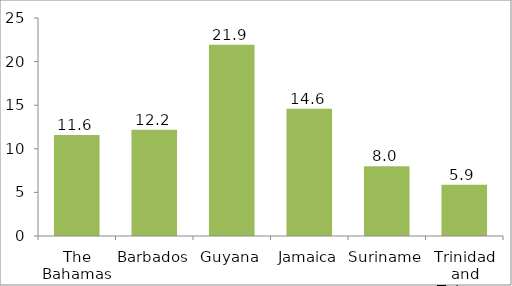
| Category | Series 0 |
|---|---|
| The Bahamas | 11.569 |
| Barbados | 12.191 |
| Guyana | 21.932 |
| Jamaica | 14.6 |
| Suriname | 8.008 |
| Trinidad and Tobago | 5.869 |